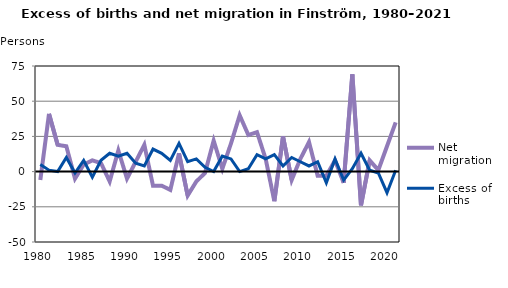
| Category | Net migration | Excess of births |
|---|---|---|
| 1980.0 | -6 | 5 |
| 1981.0 | 41 | 1 |
| 1982.0 | 19 | 0 |
| 1983.0 | 18 | 10 |
| 1984.0 | -5 | -1 |
| 1985.0 | 5 | 8 |
| 1986.0 | 8 | -4 |
| 1987.0 | 6 | 8 |
| 1988.0 | -7 | 13 |
| 1989.0 | 15 | 11 |
| 1990.0 | -5 | 13 |
| 1991.0 | 7 | 6 |
| 1992.0 | 19 | 4 |
| 1993.0 | -10 | 16 |
| 1994.0 | -10 | 13 |
| 1995.0 | -13 | 8 |
| 1996.0 | 13 | 20 |
| 1997.0 | -17 | 7 |
| 1998.0 | -7 | 9 |
| 1999.0 | -1 | 3 |
| 2000.0 | 22 | 0 |
| 2001.0 | 2 | 11 |
| 2002.0 | 20 | 9 |
| 2003.0 | 40 | 0 |
| 2004.0 | 26 | 2 |
| 2005.0 | 28 | 12 |
| 2006.0 | 9 | 9 |
| 2007.0 | -21 | 12 |
| 2008.0 | 25 | 4 |
| 2009.0 | -6 | 10 |
| 2010.0 | 9 | 7 |
| 2011.0 | 21 | 4 |
| 2012.0 | -3 | 7 |
| 2013.0 | -3 | -8 |
| 2014.0 | 8 | 9 |
| 2015.0 | -8 | -6 |
| 2016.0 | 69 | 2 |
| 2017.0 | -24 | 13 |
| 2018.0 | 8 | 1 |
| 2019.0 | 1 | -1 |
| 2020.0 | 18 | -15 |
| 2021.0 | 35 | 1 |